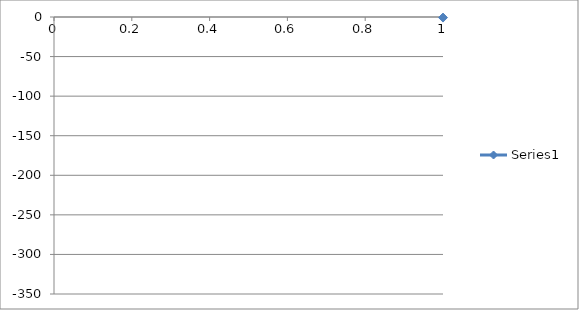
| Category | Series 0 |
|---|---|
| 0 | -0.734 |
| 1 | -0.8 |
| 2 | -0.861 |
| 3 | -0.916 |
| 4 | -0.97 |
| 5 | -1.026 |
| 6 | -1.106 |
| 7 | -1.159 |
| 8 | -1.255 |
| 9 | -1.355 |
| 10 | -1.46 |
| 11 | -1.572 |
| 12 | -1.721 |
| 13 | -1.859 |
| 14 | -2.033 |
| 15 | -2.208 |
| 16 | -2.426 |
| 17 | -2.658 |
| 18 | -2.953 |
| 19 | -3.278 |
| 20 | -3.68 |
| 21 | -4.129 |
| 22 | -4.684 |
| 23 | -5.356 |
| 24 | -6.104 |
| 25 | -7.552 |
| 26 | -8.882 |
| 27 | -10.371 |
| 28 | -12.297 |
| 29 | -15.165 |
| 30 | -18.271 |
| 31 | -20.011 |
| 32 | -21.737 |
| 33 | -24.219 |
| 34 | -26.146 |
| 35 | -29.017 |
| 36 | -31.861 |
| 37 | -34.884 |
| 38 | -38.682 |
| 39 | -42.815 |
| 40 | -47.176 |
| 41 | -52.145 |
| 42 | -57.784 |
| 43 | -63.713 |
| 44 | -70.638 |
| 45 | -77.87 |
| 46 | -86.646 |
| 47 | -95.681 |
| 48 | -105.279 |
| 49 | -115.86 |
| 50 | -127.131 |
| 51 | -138.639 |
| 52 | -151.18 |
| 53 | -163.814 |
| 54 | -176.632 |
| 55 | -189.335 |
| 56 | -202.469 |
| 57 | -215.627 |
| 58 | -227.831 |
| 59 | -239.531 |
| 60 | -250.941 |
| 61 | -261.755 |
| 62 | -271.008 |
| 63 | -279.786 |
| 64 | -287.823 |
| 65 | -295.156 |
| 66 | -301.291 |
| 67 | -306.819 |
| 68 | -311.257 |
| 69 | -315.491 |
| 70 | -318.429 |
| 71 | -321.285 |
| 72 | -323.177 |
| 73 | -324.74 |
| 74 | -326.164 |
| 75 | -326.73 |
| 76 | -327.341 |
| 77 | -327.845 |
| 78 | -328.281 |
| 79 | -328.515 |
| 80 | -328.657 |
| 81 | -328.74 |
| 82 | -328.748 |
| 83 | -328.653 |
| 84 | -328.411 |
| 85 | -328.04 |
| 86 | -327.43 |
| 87 | -325.964 |
| 88 | -324.437 |
| 89 | -322.659 |
| 90 | -319.918 |
| 91 | -316.463 |
| 92 | -312.581 |
| 93 | -307.595 |
| 94 | -302.213 |
| 95 | -296.197 |
| 96 | -288.697 |
| 97 | -280.626 |
| 98 | -271.828 |
| 99 | -261.849 |
| 100 | -250.864 |
| 101 | -239.626 |
| 102 | -227.671 |
| 103 | -215.471 |
| 104 | -202.399 |
| 105 | -189.323 |
| 106 | -176.323 |
| 107 | -163.667 |
| 108 | -150.662 |
| 109 | -138.353 |
| 110 | -126.436 |
| 111 | -115.631 |
| 112 | -104.922 |
| 113 | -95.422 |
| 114 | -86.389 |
| 115 | -78.138 |
| 116 | -70.646 |
| 117 | -63.454 |
| 118 | -57.461 |
| 119 | -52.418 |
| 120 | -46.998 |
| 121 | -42.717 |
| 122 | -38.751 |
| 123 | -34.915 |
| 124 | -32.071 |
| 125 | -29.266 |
| 126 | -26.541 |
| 127 | -24.144 |
| 128 | -22.46 |
| 129 | -20.749 |
| 130 | -19.112 |
| 131 | -15.466 |
| 132 | -12.754 |
| 133 | -10.98 |
| 134 | -9.176 |
| 135 | -7.746 |
| 136 | -7.007 |
| 137 | -6.123 |
| 138 | -5.36 |
| 139 | -4.704 |
| 140 | -4.129 |
| 141 | -3.653 |
| 142 | -3.228 |
| 143 | -2.871 |
| 144 | -2.549 |
| 145 | -2.302 |
| 146 | -2.049 |
| 147 | -1.863 |
| 148 | -1.676 |
| 149 | -1.519 |
| 150 | -1.374 |
| 151 | -1.253 |
| 152 | -1.131 |
| 153 | -1.026 |
| 154 | -0.932 |
| 155 | -0.849 |
| 156 | -0.801 |
| 157 | -0.719 |
| 158 | -0.659 |
| 159 | -0.58 |
| 160 | -0.543 |